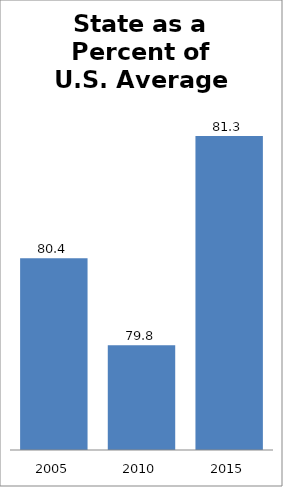
| Category | Series 0 |
|---|---|
| 2005.0 | 80.378 |
| 2010.0 | 79.753 |
| 2015.0 | 81.255 |